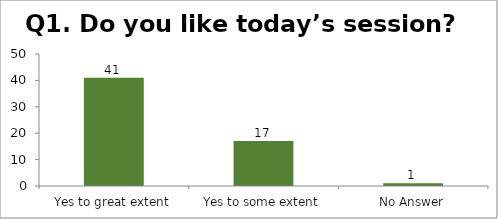
| Category | Q1. Do you like today’s session? |
|---|---|
| Yes to great extent | 41 |
| Yes to some extent | 17 |
| No Answer | 1 |